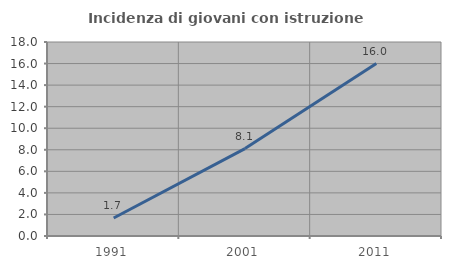
| Category | Incidenza di giovani con istruzione universitaria |
|---|---|
| 1991.0 | 1.667 |
| 2001.0 | 8.108 |
| 2011.0 | 16 |